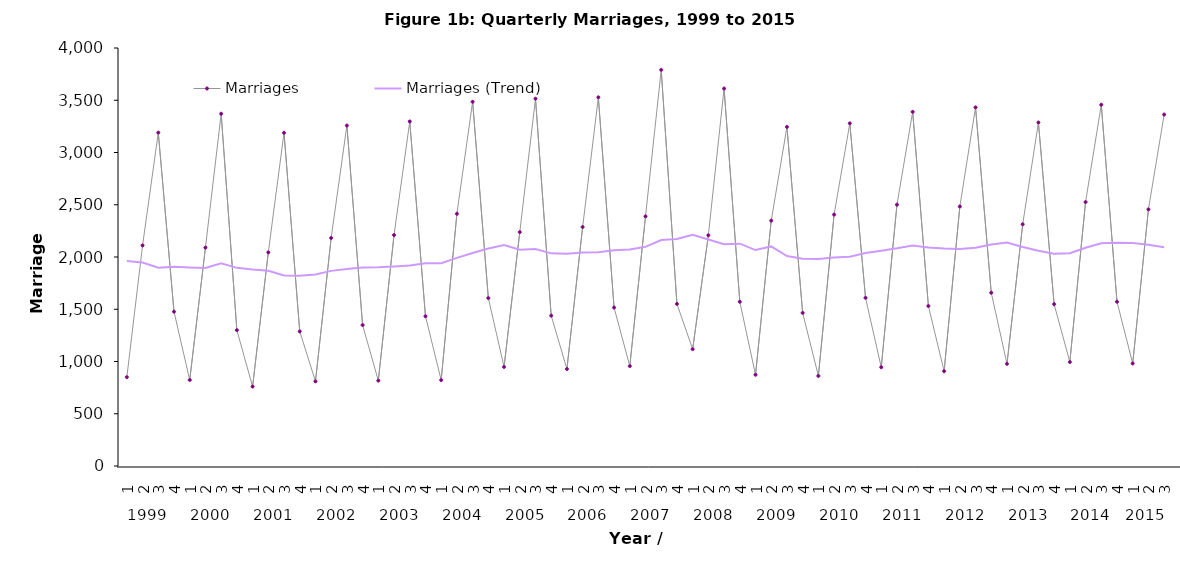
| Category | Marriages | Marriages (Trend) |
|---|---|---|
| 0 | 850 | 1961.25 |
| 1 | 2111 | 1946.75 |
| 2 | 3190 | 1898.25 |
| 3 | 1477 | 1907 |
| 4 | 823 | 1900.25 |
| 5 | 2090 | 1895 |
| 6 | 3371 | 1940.25 |
| 7 | 1300 | 1896 |
| 8 | 760 | 1880.25 |
| 9 | 2044 | 1868.75 |
| 10 | 3189 | 1823.25 |
| 11 | 1288 | 1820.25 |
| 12 | 810 | 1832.75 |
| 13 | 2182 | 1867.25 |
| 14 | 3258 | 1884.5 |
| 15 | 1349 | 1899.75 |
| 16 | 817 | 1901.5 |
| 17 | 2210 | 1908.5 |
| 18 | 3297 | 1918.25 |
| 19 | 1433 | 1939.25 |
| 20 | 822 | 1940.5 |
| 21 | 2414 | 1991.5 |
| 22 | 3485 | 2038.5 |
| 23 | 1607 | 2082 |
| 24 | 948 | 2113.5 |
| 25 | 2238 | 2069.5 |
| 26 | 3515 | 2077 |
| 27 | 1439 | 2035 |
| 28 | 928 | 2030 |
| 29 | 2287 | 2042.25 |
| 30 | 3528 | 2045.5 |
| 31 | 1516 | 2064.75 |
| 32 | 956 | 2071.75 |
| 33 | 2389 | 2097.25 |
| 34 | 3791 | 2163 |
| 35 | 1551 | 2171.75 |
| 36 | 1118 | 2212.25 |
| 37 | 2208 | 2167 |
| 38 | 3612 | 2122.25 |
| 39 | 1572 | 2127.5 |
| 40 | 873 | 2066.25 |
| 41 | 2348 | 2101.25 |
| 42 | 3245 | 2009.5 |
| 43 | 1465 | 1982.75 |
| 44 | 862 | 1980 |
| 45 | 2406 | 1994.5 |
| 46 | 3279 | 2003 |
| 47 | 1609 | 2039 |
| 48 | 945 | 2059.75 |
| 49 | 2501 | 2083.5 |
| 50 | 3389 | 2111 |
| 51 | 1531 | 2091.5 |
| 52 | 907 | 2082 |
| 53 | 2483 | 2077.5 |
| 54 | 3432 | 2088.25 |
| 55 | 1658 | 2120 |
| 56 | 978 | 2137.75 |
| 57 | 2313 | 2095.25 |
| 58 | 3287 | 2059 |
| 59 | 1548 | 2031.5 |
| 60 | 995 | 2035.75 |
| 61 | 2526 | 2089 |
| 62 | 3457 | 2131.5 |
| 63 | 1572 | 2137.5 |
| 64 | 981 | 2134 |
| 65 | 2456 | 2116.5 |
| 66 | 3363 | 2093 |